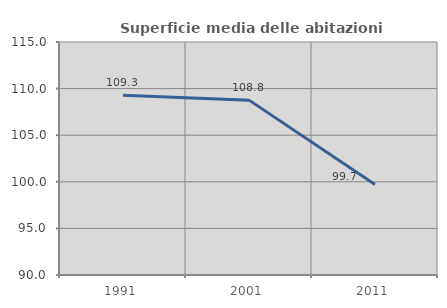
| Category | Superficie media delle abitazioni occupate |
|---|---|
| 1991.0 | 109.298 |
| 2001.0 | 108.763 |
| 2011.0 | 99.711 |